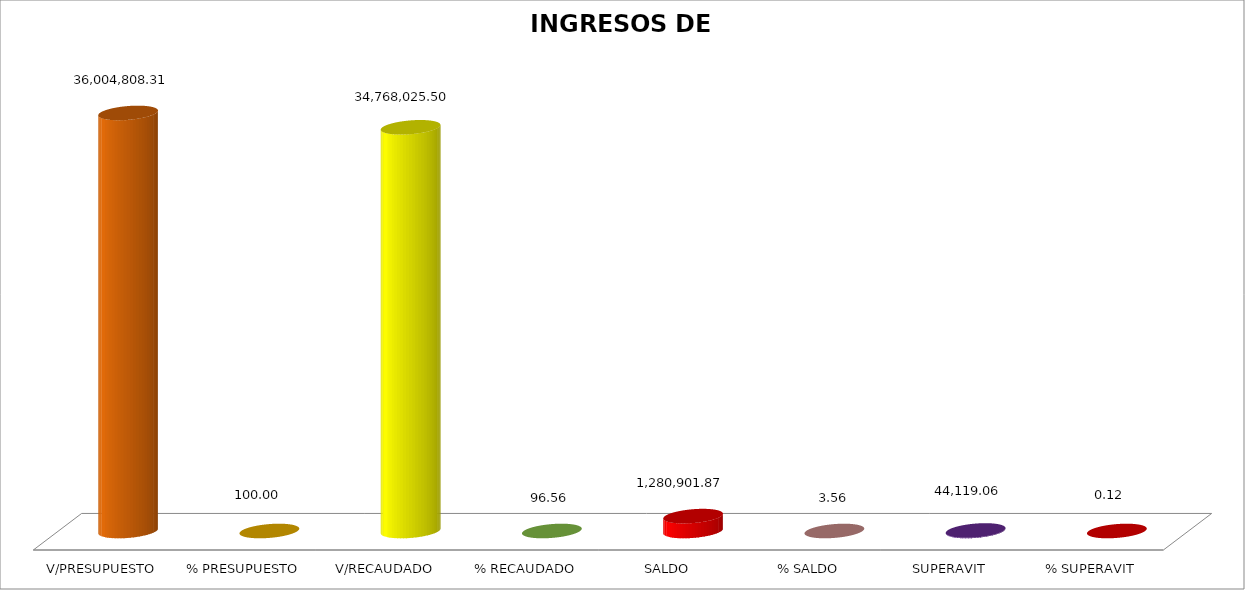
| Category | INGRESOS DE FINANCIAMIENTO |
|---|---|
| V/PRESUPUESTO | 36004808.31 |
| % PRESUPUESTO | 100 |
| V/RECAUDADO | 34768025.5 |
| % RECAUDADO | 96.565 |
| SALDO | 1280901.87 |
| % SALDO | 3.558 |
| SUPERAVIT | 44119.06 |
| % SUPERAVIT | 0.123 |